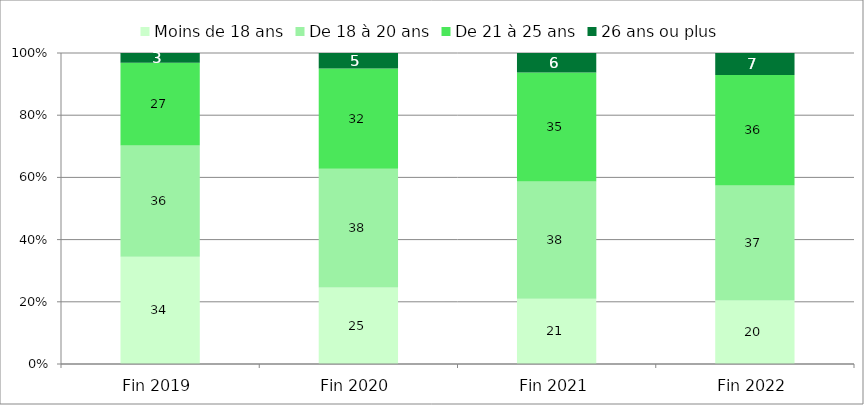
| Category | Moins de 18 ans | De 18 à 20 ans | De 21 à 25 ans | 26 ans ou plus |
|---|---|---|---|---|
| Fin 2019 | 34.482 | 35.799 | 26.602 | 3.117 |
| Fin 2020 | 24.604 | 38.191 | 32.229 | 4.976 |
| Fin 2021 | 20.981 | 37.708 | 35.035 | 6.276 |
| Fin 2022 | 20.407 | 37.006 | 35.515 | 7.072 |